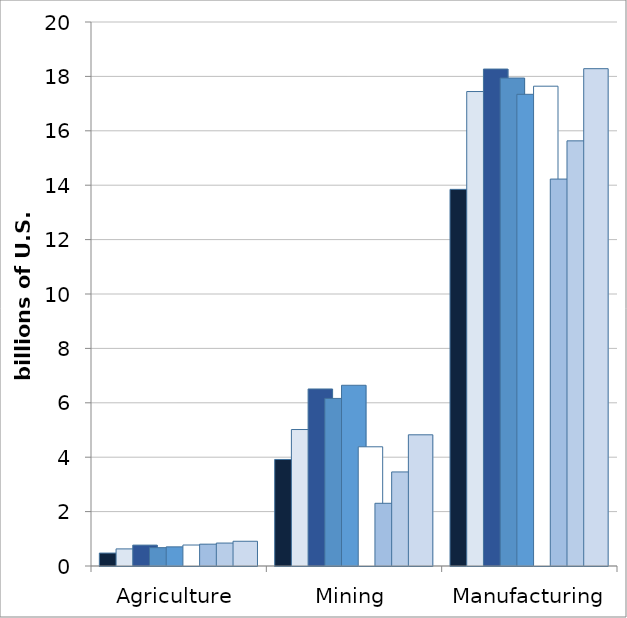
| Category | 2010 | 2011 | 2012 | 2013 | 2014 | 2015 | 2016 | 2017 | 2018 |
|---|---|---|---|---|---|---|---|---|---|
| Agriculture | 0.476 | 0.629 | 0.768 | 0.674 | 0.704 | 0.771 | 0.803 | 0.844 | 0.909 |
| Mining | 3.916 | 5.018 | 6.508 | 6.161 | 6.644 | 4.383 | 2.306 | 3.458 | 4.823 |
| Manufacturing | 13.847 | 17.443 | 18.27 | 17.94 | 17.342 | 17.64 | 14.225 | 15.631 | 18.284 |